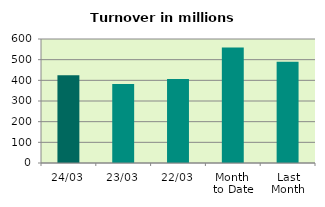
| Category | Series 0 |
|---|---|
| 24/03 | 424.942 |
| 23/03 | 382.636 |
| 22/03 | 406.253 |
| Month 
to Date | 559.045 |
| Last
Month | 490.433 |